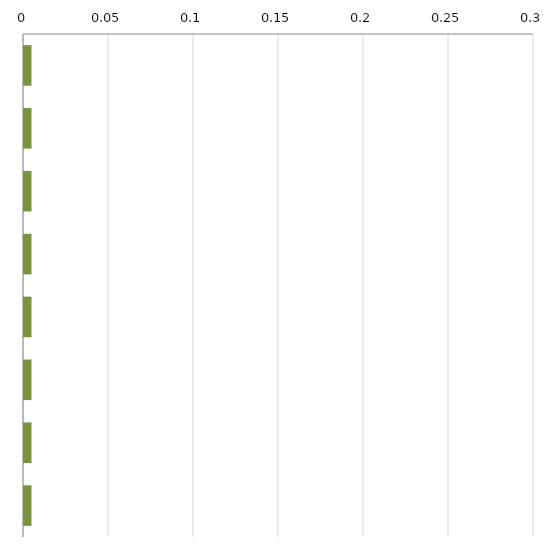
| Category | Series 0 | Series 1 |
|---|---|---|
| 0 | 0 | 0.005 |
| 1 | 0 | 0.005 |
| 2 | 0 | 0.005 |
| 3 | 0 | 0.005 |
| 4 | 0 | 0.005 |
| 5 | 0 | 0.005 |
| 6 | 0 | 0.005 |
| 7 | 0 | 0.005 |